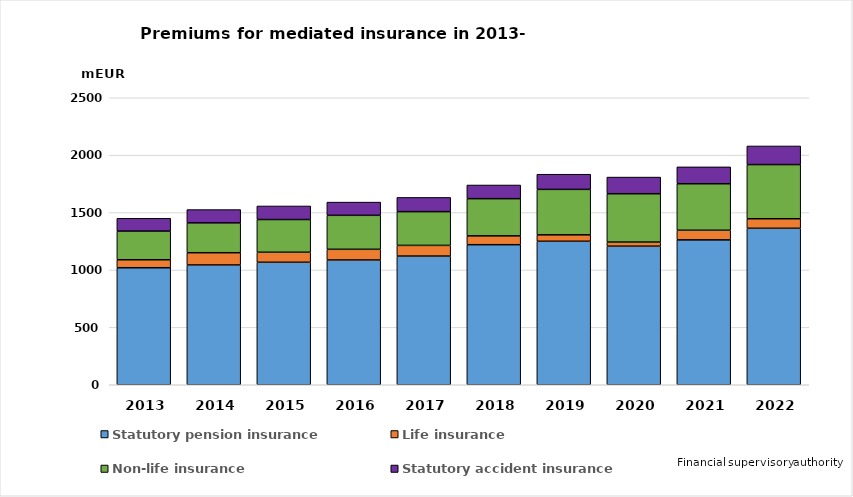
| Category | Statutory pension insurance | Life insurance | Non-life insurance | Statutory accident insurance |
|---|---|---|---|---|
| 2013.0 | 1019.216 | 69.648 | 249.823 | 111.515 |
| 2014.0 | 1043.573 | 106.619 | 259.835 | 115.957 |
| 2015.0 | 1067.062 | 87.285 | 284.943 | 118.153 |
| 2016.0 | 1087 | 93 | 296 | 115 |
| 2017.0 | 1121 | 93 | 294 | 124 |
| 2018.0 | 1220 | 77 | 324 | 119 |
| 2019.0 | 1250 | 56 | 396 | 132 |
| 2020.0 | 1207 | 36 | 421 | 145 |
| 2021.0 | 1262 | 84 | 405 | 147 |
| 2022.0 | 1363 | 83 | 472 | 162 |